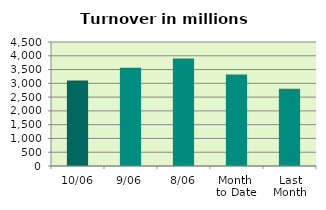
| Category | Series 0 |
|---|---|
| 10/06 | 3102.156 |
| 9/06 | 3568.986 |
| 8/06 | 3903.911 |
| Month 
to Date | 3323.339 |
| Last
Month | 2802.964 |